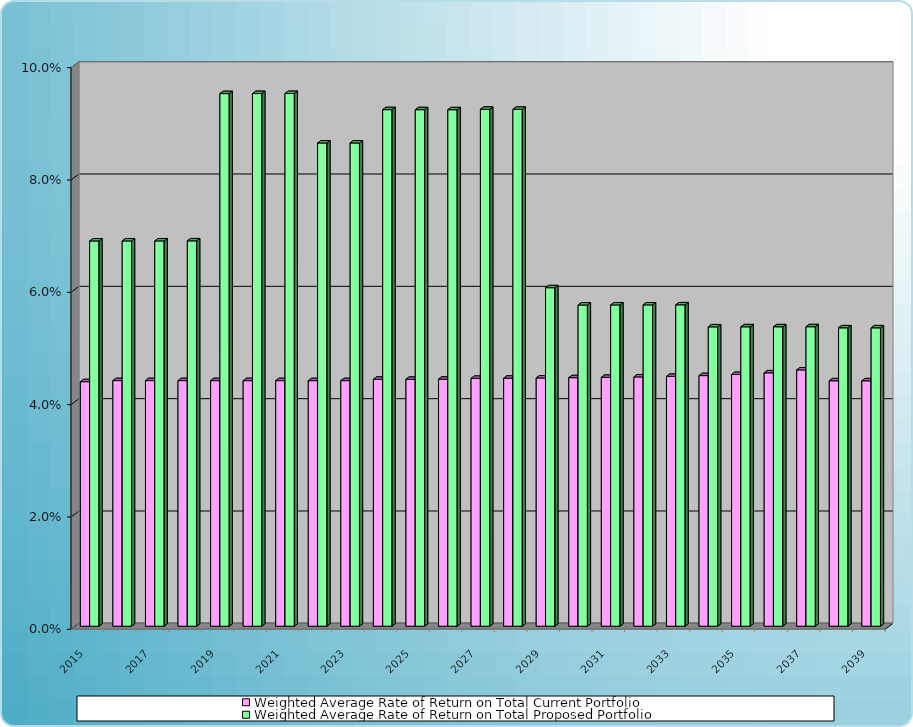
| Category | Weighted Average Rate of Return on Total Current Portfolio | Weighted Average Rate of Return on Total Proposed Portfolio |
|---|---|---|
| 2015.0 | 0.044 | 0.069 |
| 2016.0 | 0.044 | 0.069 |
| 2017.0 | 0.044 | 0.069 |
| 2018.0 | 0.044 | 0.069 |
| 2019.0 | 0.044 | 0.095 |
| 2020.0 | 0.044 | 0.095 |
| 2021.0 | 0.044 | 0.095 |
| 2022.0 | 0.044 | 0.086 |
| 2023.0 | 0.044 | 0.086 |
| 2024.0 | 0.044 | 0.092 |
| 2025.0 | 0.044 | 0.092 |
| 2026.0 | 0.044 | 0.092 |
| 2027.0 | 0.044 | 0.092 |
| 2028.0 | 0.044 | 0.092 |
| 2029.0 | 0.044 | 0.06 |
| 2030.0 | 0.044 | 0.057 |
| 2031.0 | 0.044 | 0.057 |
| 2032.0 | 0.044 | 0.057 |
| 2033.0 | 0.044 | 0.057 |
| 2034.0 | 0.045 | 0.053 |
| 2035.0 | 0.045 | 0.053 |
| 2036.0 | 0.045 | 0.053 |
| 2037.0 | 0.046 | 0.053 |
| 2038.0 | 0.044 | 0.053 |
| 2039.0 | 0.044 | 0.053 |